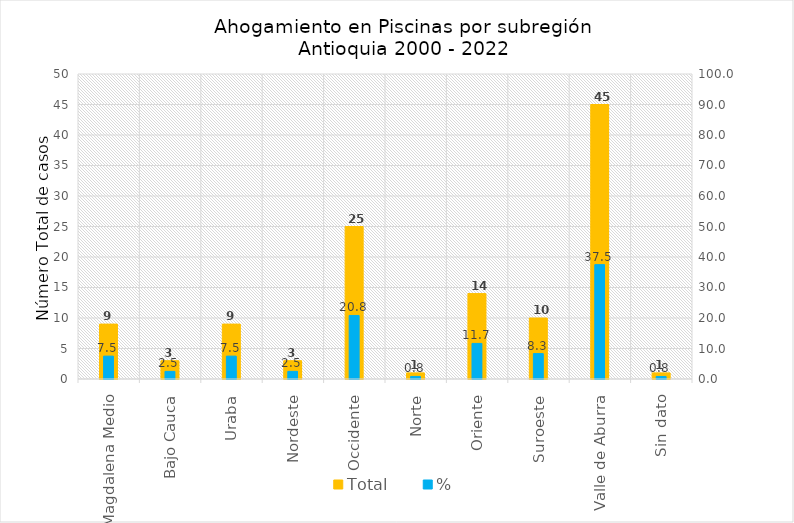
| Category | Total |
|---|---|
| Magdalena Medio | 9 |
| Bajo Cauca | 3 |
| Uraba | 9 |
| Nordeste | 3 |
| Occidente | 25 |
| Norte | 1 |
| Oriente | 14 |
| Suroeste | 10 |
| Valle de Aburra | 45 |
| Sin dato | 1 |